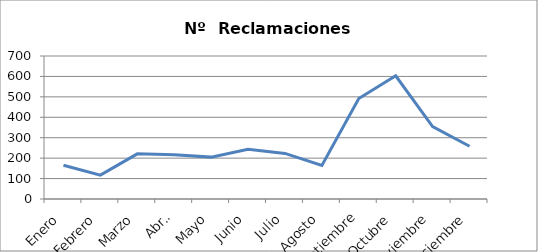
| Category | Series 0 |
|---|---|
| Enero | 165 |
| Febrero | 117 |
| Marzo | 221 |
| Abril | 217 |
| Mayo | 205 |
| Junio | 243 |
| Julio | 223 |
| Agosto | 164 |
| Septiembre | 492 |
| Octubre | 603 |
| Noviembre | 354 |
| Diciembre | 258 |